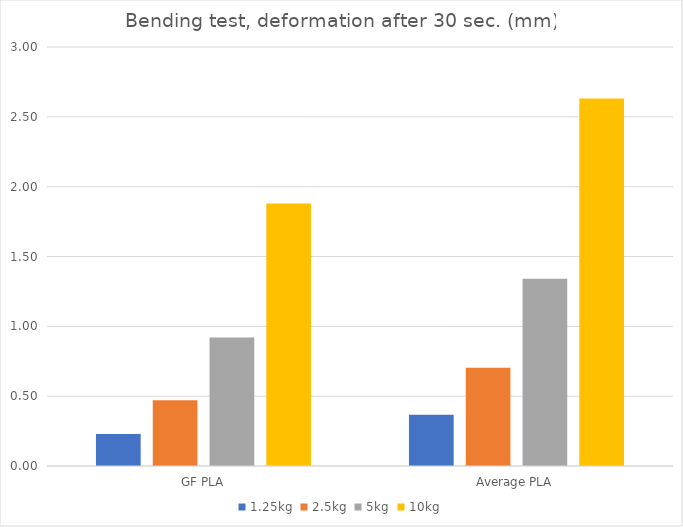
| Category | 1.25kg | 2.5kg | 5kg | 10kg |
|---|---|---|---|---|
| GF PLA | 0.23 | 0.47 | 0.92 | 1.88 |
| Average PLA | 0.367 | 0.703 | 1.341 | 2.631 |